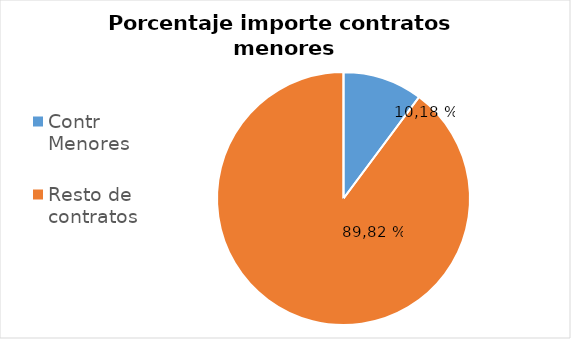
| Category | Series 0 |
|---|---|
| Contr Menores | 10.184 |
| Resto de contratos | 89.816 |